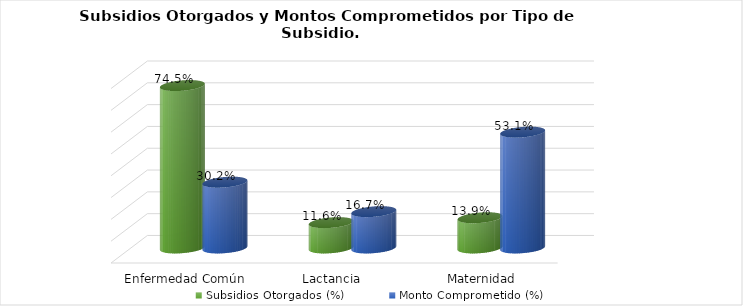
| Category | Subsidios Otorgados (%) | Monto Comprometido (%) |
|---|---|---|
| Enfermedad Común | 0.745 | 0.302 |
| Lactancia  | 0.116 | 0.167 |
| Maternidad | 0.139 | 0.531 |